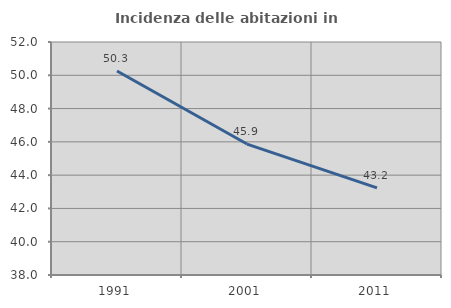
| Category | Incidenza delle abitazioni in proprietà  |
|---|---|
| 1991.0 | 50.254 |
| 2001.0 | 45.868 |
| 2011.0 | 43.235 |